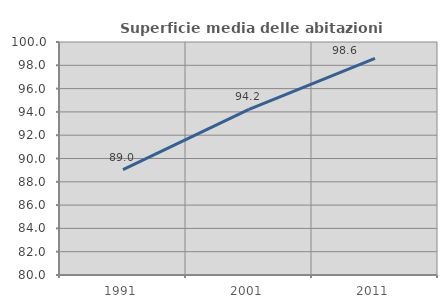
| Category | Superficie media delle abitazioni occupate |
|---|---|
| 1991.0 | 89.048 |
| 2001.0 | 94.221 |
| 2011.0 | 98.597 |